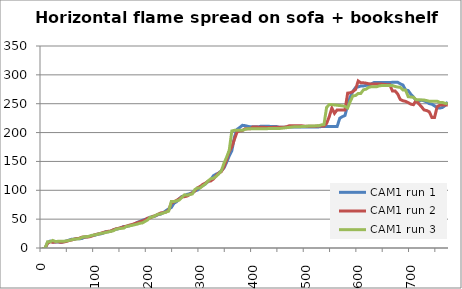
| Category | CAM1 run 1 | CAM1 run 2 | CAM1 run 3 |
|---|---|---|---|
| 0.0 | -1 | -1 | -1 |
| 5.0 | -1 | -1 | -1 |
| 10.0 | 9.124 | 8.375 | 10.964 |
| 15.0 | 12.001 | 10.834 | 10.964 |
| 20.0 | 10.585 | 9.836 | 13.127 |
| 25.0 | 10.585 | 10.539 | 11.127 |
| 30.0 | 10.585 | 10.767 | 11.623 |
| 35.0 | 9.853 | 9.822 | 11.623 |
| 40.0 | 10.801 | 10.292 | 11.623 |
| 45.0 | 12.001 | 11.248 | 12.123 |
| 50.0 | 13.46 | 12.718 | 12.969 |
| 55.0 | 14.951 | 13.714 | 14.139 |
| 60.0 | 14.951 | 15.227 | 15.119 |
| 65.0 | 16.464 | 16.246 | 15.612 |
| 70.0 | 15.957 | 16.758 | 16.108 |
| 75.0 | 16.464 | 18.818 | 18.106 |
| 80.0 | 18.506 | 18.962 | 19.619 |
| 85.0 | 19.536 | 18.962 | 19.619 |
| 90.0 | 20.053 | 19.476 | 20.633 |
| 95.0 | 21.608 | 21.023 | 22.16 |
| 100.0 | 22.129 | 23.1 | 22.67 |
| 105.0 | 23.821 | 24.142 | 23.693 |
| 110.0 | 24.342 | 25.186 | 25.232 |
| 115.0 | 25.384 | 26.757 | 25.746 |
| 120.0 | 28.001 | 27.806 | 26.775 |
| 125.0 | 28.119 | 28.857 | 27.805 |
| 130.0 | 29.165 | 29.383 | 28.837 |
| 135.0 | 31.262 | 31.585 | 29.87 |
| 140.0 | 32.84 | 33.163 | 32.458 |
| 145.0 | 33.267 | 34.217 | 33.495 |
| 150.0 | 35.382 | 35.272 | 34.014 |
| 155.0 | 37.346 | 36.855 | 34.533 |
| 160.0 | 37.346 | 37.912 | 37.65 |
| 165.0 | 38.411 | 39.498 | 38.17 |
| 170.0 | 40.008 | 40.557 | 39.21 |
| 175.0 | 41.074 | 42.146 | 40.251 |
| 180.0 | 44.274 | 43.736 | 41.292 |
| 185.0 | 45.875 | 45.327 | 42.855 |
| 190.0 | 48.01 | 46.919 | 43.377 |
| 195.0 | 49.612 | 48.511 | 45.984 |
| 200.0 | 51.167 | 51.699 | 48.593 |
| 205.0 | 53.307 | 52.231 | 53.294 |
| 210.0 | 54.376 | 54.89 | 53.816 |
| 215.0 | 55.491 | 55.954 | 56.43 |
| 220.0 | 57.73 | 58.615 | 58.571 |
| 225.0 | 58.797 | 60.745 | 59.093 |
| 230.0 | 61.468 | 61.277 | 60.661 |
| 235.0 | 64.674 | 62.342 | 62.23 |
| 240.0 | 67.881 | 65.539 | 63.798 |
| 245.0 | 70.02 | 77.729 | 80.511 |
| 250.0 | 77.436 | 79.865 | 80.478 |
| 255.0 | 80.114 | 82.536 | 81.526 |
| 260.0 | 85.472 | 85.207 | 83.099 |
| 265.0 | 89.196 | 88.412 | 87.818 |
| 270.0 | 90.268 | 88.946 | 92.144 |
| 275.0 | 92.948 | 90.015 | 91.548 |
| 280.0 | 94.021 | 92.686 | 92.597 |
| 285.0 | 96.191 | 95.358 | 93.645 |
| 290.0 | 98.871 | 99.098 | 101.507 |
| 295.0 | 100.479 | 104.443 | 104.101 |
| 300.0 | 105.926 | 106.606 | 104.159 |
| 305.0 | 108.038 | 110.347 | 107.932 |
| 310.0 | 111.316 | 112.511 | 111.038 |
| 315.0 | 115.034 | 115.717 | 116.278 |
| 320.0 | 118.25 | 116.251 | 119.947 |
| 325.0 | 125.217 | 119.485 | 120.964 |
| 330.0 | 127.871 | 125.362 | 124.082 |
| 335.0 | 130.016 | 129.637 | 128.23 |
| 340.0 | 133.707 | 132.284 | 133.477 |
| 345.0 | 138.535 | 140.302 | 146.685 |
| 350.0 | 148.208 | 152.598 | 157.175 |
| 355.0 | 159.458 | 167.034 | 169.239 |
| 360.0 | 168.627 | 175.038 | 202.839 |
| 365.0 | 192.247 | 188.441 | 203.888 |
| 370.0 | 205.59 | 201.275 | 203.888 |
| 375.0 | 208.81 | 202.879 | 203.888 |
| 380.0 | 212.558 | 203.414 | 203.888 |
| 385.0 | 212.021 | 206.623 | 205.462 |
| 390.0 | 210.948 | 206.623 | 206.512 |
| 395.0 | 209.874 | 206.623 | 206.512 |
| 400.0 | 209.874 | 209.867 | 206.512 |
| 405.0 | 209.874 | 209.867 | 206.512 |
| 410.0 | 209.867 | 209.332 | 206.492 |
| 415.0 | 210.94 | 209.332 | 206.492 |
| 420.0 | 210.94 | 209.314 | 206.492 |
| 425.0 | 210.94 | 208.779 | 206.492 |
| 430.0 | 210.94 | 208.779 | 207.017 |
| 435.0 | 210.393 | 208.779 | 207.017 |
| 440.0 | 210.393 | 209.314 | 207.017 |
| 445.0 | 210.387 | 209.314 | 207.017 |
| 450.0 | 209.313 | 209.314 | 207.017 |
| 455.0 | 209.313 | 209.314 | 207.542 |
| 460.0 | 209.313 | 209.314 | 208.066 |
| 465.0 | 209.313 | 210.421 | 208.591 |
| 470.0 | 209.85 | 212.025 | 209.116 |
| 475.0 | 209.85 | 212.025 | 209.641 |
| 480.0 | 209.85 | 212.025 | 210.166 |
| 485.0 | 209.85 | 212.025 | 210.166 |
| 490.0 | 209.85 | 212.025 | 210.166 |
| 495.0 | 209.85 | 211.491 | 210.69 |
| 500.0 | 209.85 | 210.956 | 210.69 |
| 505.0 | 209.85 | 210.956 | 211.215 |
| 510.0 | 209.85 | 210.956 | 211.215 |
| 515.0 | 209.85 | 210.956 | 211.215 |
| 520.0 | 209.85 | 210.956 | 211.74 |
| 525.0 | 209.85 | 211.491 | 211.74 |
| 530.0 | 210.386 | 211.491 | 213.314 |
| 535.0 | 210.386 | 211.471 | 213.839 |
| 540.0 | 210.386 | 215.749 | 243.711 |
| 545.0 | 210.386 | 227.496 | 248.436 |
| 550.0 | 210.386 | 242.486 | 248.436 |
| 555.0 | 210.386 | 233.336 | 247.911 |
| 560.0 | 210.386 | 239.295 | 247.386 |
| 565.0 | 224.877 | 239.277 | 246.861 |
| 570.0 | 227.561 | 239.277 | 246.324 |
| 575.0 | 229.708 | 239.277 | 245.274 |
| 580.0 | 247.956 | 268.359 | 242.639 |
| 585.0 | 261.929 | 268.894 | 254.171 |
| 590.0 | 271.589 | 271.031 | 263.649 |
| 595.0 | 278.036 | 274.773 | 264.174 |
| 600.0 | 279.109 | 289.394 | 267.849 |
| 605.0 | 280.719 | 286.221 | 267.849 |
| 610.0 | 280.719 | 286.189 | 274.148 |
| 615.0 | 281.793 | 285.655 | 275.198 |
| 620.0 | 281.793 | 284.587 | 278.348 |
| 625.0 | 284.476 | 284.053 | 279.398 |
| 630.0 | 286.622 | 284.022 | 279.398 |
| 635.0 | 286.622 | 284.022 | 279.398 |
| 640.0 | 286.622 | 283.992 | 280.973 |
| 645.0 | 286.622 | 283.992 | 281.498 |
| 650.0 | 286.622 | 283.429 | 281.498 |
| 655.0 | 286.622 | 282.895 | 281.498 |
| 660.0 | 286.622 | 282.895 | 281.498 |
| 665.0 | 287.159 | 272.24 | 281.498 |
| 670.0 | 287.159 | 272.24 | 279.923 |
| 675.0 | 287.159 | 266.898 | 278.884 |
| 680.0 | 284.464 | 257.285 | 278.359 |
| 685.0 | 282.329 | 255.148 | 273.672 |
| 690.0 | 273.852 | 254.08 | 273.672 |
| 695.0 | 272.779 | 251.944 | 262.156 |
| 700.0 | 266.36 | 249.274 | 261.631 |
| 705.0 | 261.532 | 248.312 | 261.106 |
| 710.0 | 255.632 | 255.812 | 256.964 |
| 715.0 | 254.023 | 249.902 | 256.964 |
| 720.0 | 256.12 | 245.109 | 256.439 |
| 725.0 | 254.955 | 239.251 | 256.439 |
| 730.0 | 253.072 | 238.186 | 255.39 |
| 735.0 | 250.232 | 236.057 | 254.362 |
| 740.0 | 249.123 | 226.117 | 254.362 |
| 745.0 | 246.301 | 226.117 | 254.362 |
| 750.0 | 242.989 | 244.736 | 254.362 |
| 755.0 | 242.454 | 247.565 | 252.263 |
| 760.0 | 243.525 | 247.565 | 252.263 |
| 765.0 | 246.837 | 247.565 | 250.712 |
| 770.0 | 252.908 | 247.565 | 250.211 |